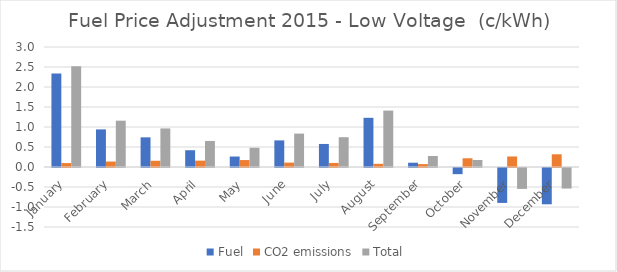
| Category | Fuel | CO2 emissions | Total |
|---|---|---|---|
| January | 2.34 | 0.098 | 2.522 |
| February | 0.94 | 0.137 | 1.158 |
| March | 0.741 | 0.156 | 0.964 |
| April | 0.419 | 0.16 | 0.651 |
| May | 0.262 | 0.174 | 0.481 |
| June | 0.665 | 0.11 | 0.835 |
| July | 0.576 | 0.101 | 0.745 |
| August | 1.23 | 0.08 | 1.41 |
| September | 0.107 | 0.072 | 0.275 |
| October | -0.154 | 0.218 | 0.175 |
| November | -0.873 | 0.263 | -0.523 |
| December | -0.907 | 0.318 | -0.514 |